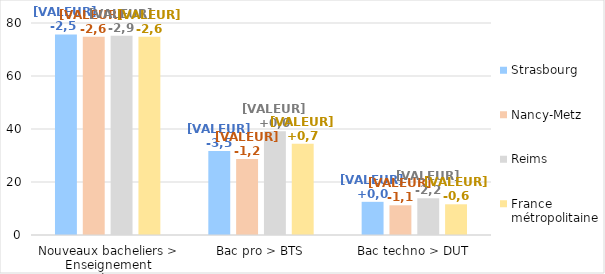
| Category | Strasbourg | Nancy-Metz | Reims | France métropolitaine |
|---|---|---|---|---|
| Nouveaux bacheliers > Enseignement supérieur* | 75.7 | 74.8 | 75.2 | 74.8 |
| Bac pro > BTS | 31.66 | 28.7 | 39.17 | 34.45 |
| Bac techno > DUT | 12.52 | 11.21 | 13.86 | 11.59 |